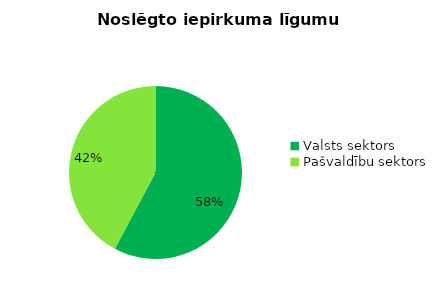
| Category | Noslēgto iepirkuma līgumu skaits |
|---|---|
| Valsts sektors | 390 |
| Pašvaldību sektors | 285 |